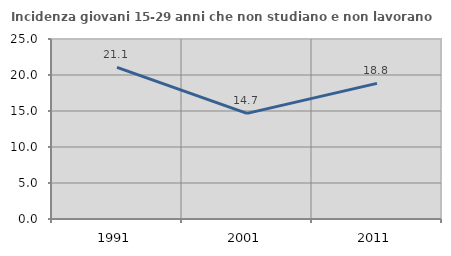
| Category | Incidenza giovani 15-29 anni che non studiano e non lavorano  |
|---|---|
| 1991.0 | 21.053 |
| 2001.0 | 14.672 |
| 2011.0 | 18.841 |